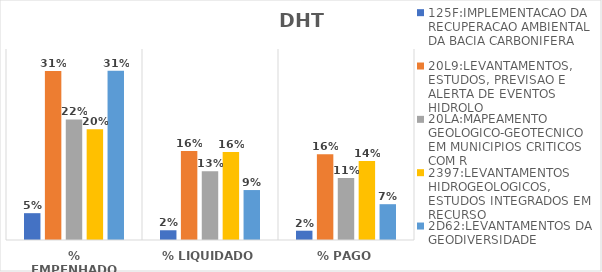
| Category | 125F:IMPLEMENTACAO DA RECUPERACAO AMBIENTAL DA BACIA CARBONIFERA | 20L9:LEVANTAMENTOS, ESTUDOS, PREVISAO E ALERTA DE EVENTOS HIDROLO | 20LA:MAPEAMENTO GEOLOGICO-GEOTECNICO EM MUNICIPIOS CRITICOS COM R | 2397:LEVANTAMENTOS HIDROGEOLOGICOS, ESTUDOS INTEGRADOS EM RECURSO | 2D62:LEVANTAMENTOS DA GEODIVERSIDADE |
|---|---|---|---|---|---|
| % EMPENHADO | 0.049 | 0.309 | 0.221 | 0.203 | 0.31 |
| % LIQUIDADO | 0.018 | 0.163 | 0.126 | 0.161 | 0.092 |
| % PAGO | 0.017 | 0.157 | 0.113 | 0.145 | 0.066 |